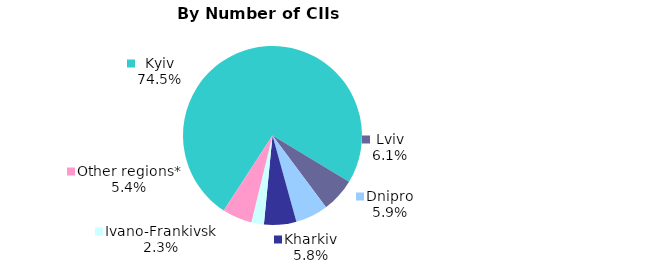
| Category | Series 0 |
|---|---|
| Kyiv | 0.745 |
| Lviv | 0.061 |
| Dnipro | 0.059 |
| Kharkiv | 0.058 |
| Ivano-Frankivsk | 0.023 |
| Other regions* | 0.054 |